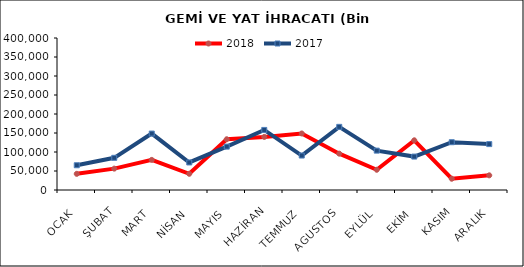
| Category | 2018 | 2017 |
|---|---|---|
| OCAK | 42524.266 | 65125.64 |
| ŞUBAT | 56242.34 | 84700.491 |
| MART | 79226.622 | 148505.582 |
| NİSAN | 42637.634 | 72460.499 |
| MAYIS | 133538.686 | 114131.607 |
| HAZİRAN | 139721.959 | 158069.967 |
| TEMMUZ | 148742.766 | 90677.541 |
| AGUSTOS | 95641.844 | 166168.74 |
| EYLÜL | 53268.904 | 103600.683 |
| EKİM | 130754.858 | 87976.727 |
| KASIM | 29652.93 | 125763.031 |
| ARALIK | 38576.354 | 120779.265 |